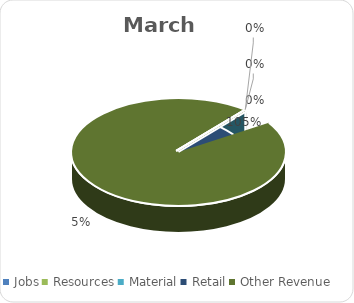
| Category | March |
|---|---|
| Jobs | 0 |
| Resources | 0 |
| Material | 0 |
| Retail | 568053.66 |
| Other Revenue | -25887.08 |